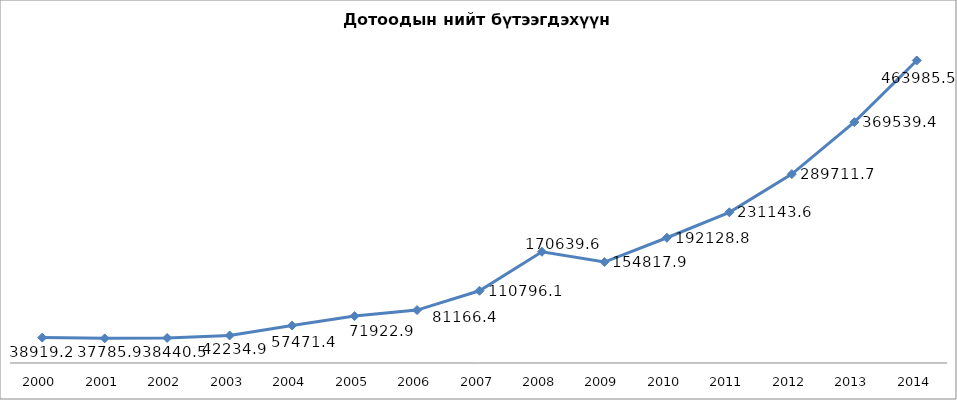
| Category | Дотоодын нийт бүтээгдэхүүн /сая.төг/ |
|---|---|
| 2000.0 | 38919.2 |
| 2001.0 | 37785.9 |
| 2002.0 | 38440.5 |
| 2003.0 | 42234.9 |
| 2004.0 | 57471.4 |
| 2005.0 | 71922.9 |
| 2006.0 | 81166.4 |
| 2007.0 | 110796.1 |
| 2008.0 | 170639.6 |
| 2009.0 | 154817.9 |
| 2010.0 | 192128.8 |
| 2011.0 | 231143.6 |
| 2012.0 | 289711.7 |
| 2013.0 | 369539.4 |
| 2014.0 | 463985.5 |